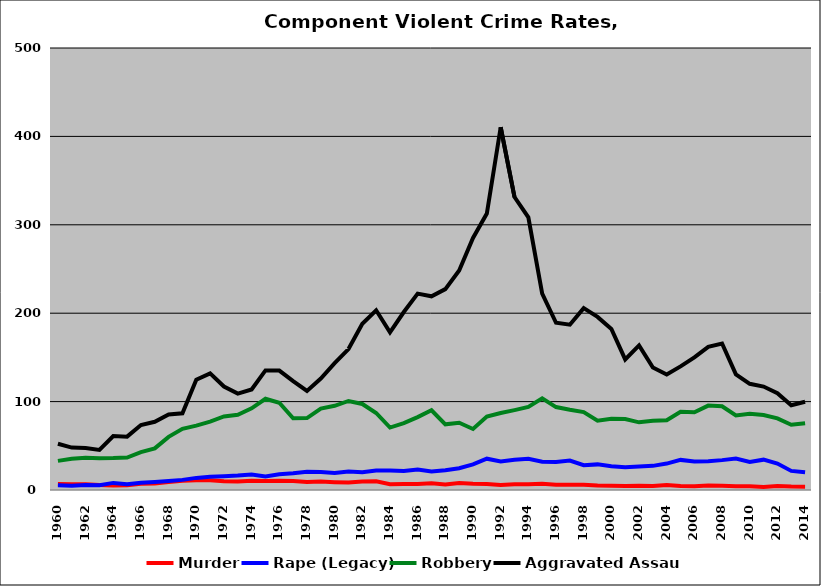
| Category | Murder | Rape (Legacy) | Robbery | Aggravated Assault |
|---|---|---|---|---|
| 1960.0 | 6.748 | 5.365 | 32.948 | 52.269 |
| 1961.0 | 6.534 | 4.746 | 35.273 | 47.952 |
| 1962.0 | 6.522 | 5.743 | 36.405 | 47.469 |
| 1963.0 | 5.557 | 5.363 | 35.832 | 45.299 |
| 1964.0 | 5.192 | 8.041 | 36.087 | 61.032 |
| 1965.0 | 5.285 | 6.574 | 36.71 | 60.365 |
| 1966.0 | 7.006 | 8.325 | 42.79 | 73.547 |
| 1967.0 | 7.212 | 9.125 | 47.099 | 77.172 |
| 1968.0 | 8.919 | 10.22 | 60.111 | 85.413 |
| 1969.0 | 10.396 | 11.448 | 69.183 | 86.726 |
| 1970.0 | 11.089 | 13.699 | 72.811 | 124.716 |
| 1971.0 | 10.908 | 14.899 | 77.422 | 131.901 |
| 1972.0 | 9.791 | 15.671 | 83.177 | 117.066 |
| 1973.0 | 9.665 | 16.308 | 85.069 | 109.066 |
| 1974.0 | 10.337 | 17.635 | 92.344 | 113.732 |
| 1975.0 | 10.159 | 15.4 | 103.18 | 135.306 |
| 1976.0 | 10.56 | 17.824 | 98.658 | 135.123 |
| 1977.0 | 10.093 | 19.057 | 81.145 | 123.279 |
| 1978.0 | 9.034 | 20.726 | 81.332 | 112.093 |
| 1979.0 | 9.498 | 20.386 | 92.061 | 126.084 |
| 1980.0 | 8.815 | 19.168 | 95.236 | 143.458 |
| 1981.0 | 8.413 | 20.923 | 100.71 | 159.465 |
| 1982.0 | 9.681 | 20.016 | 97.3 | 187.974 |
| 1983.0 | 9.801 | 21.998 | 87.13 | 203.285 |
| 1984.0 | 6.554 | 22.186 | 70.669 | 178.378 |
| 1985.0 | 6.871 | 21.632 | 75.711 | 201.315 |
| 1986.0 | 6.652 | 23.069 | 82.511 | 222.183 |
| 1987.0 | 7.513 | 20.955 | 90.18 | 219.131 |
| 1988.0 | 6.154 | 22.44 | 74.281 | 227.251 |
| 1989.0 | 7.862 | 24.604 | 76.093 | 248.35 |
| 1990.0 | 7.164 | 28.98 | 69.058 | 285.16 |
| 1991.0 | 6.814 | 35.416 | 83.06 | 312.685 |
| 1992.0 | 5.752 | 32.197 | 87.164 | 410.36 |
| 1993.0 | 6.572 | 34.336 | 90.393 | 331.354 |
| 1994.0 | 6.376 | 35.276 | 93.938 | 308.388 |
| 1995.0 | 7.15 | 31.891 | 103.653 | 222.047 |
| 1996.0 | 5.87 | 31.668 | 93.795 | 189.161 |
| 1997.0 | 5.834 | 33.367 | 90.737 | 187.001 |
| 1998.0 | 6.021 | 28.125 | 88.11 | 205.716 |
| 1999.0 | 5.125 | 28.984 | 78.368 | 195.843 |
| 2000.0 | 4.775 | 26.993 | 80.559 | 182.173 |
| 2001.0 | 4.448 | 25.831 | 80.343 | 147.684 |
| 2002.0 | 4.67 | 26.578 | 76.556 | 163.626 |
| 2003.0 | 4.395 | 27.294 | 78.287 | 138.483 |
| 2004.0 | 5.698 | 29.89 | 78.902 | 130.618 |
| 2005.0 | 4.554 | 34.055 | 88.434 | 139.793 |
| 2006.0 | 4.208 | 32.31 | 87.968 | 150.116 |
| 2007.0 | 5.14 | 32.583 | 95.486 | 161.996 |
| 2008.0 | 4.711 | 33.793 | 94.684 | 165.674 |
| 2009.0 | 4.265 | 35.488 | 84.421 | 130.803 |
| 2010.0 | 4.309 | 31.825 | 86.372 | 120.11 |
| 2011.0 | 3.458 | 34.327 | 84.844 | 117.019 |
| 2012.0 | 4.589 | 29.956 | 80.987 | 109.413 |
| 2013.0 | 3.909 | 21.616 | 73.802 | 95.805 |
| 2014.0 | 3.625 | 20.007 | 75.587 | 99.786 |